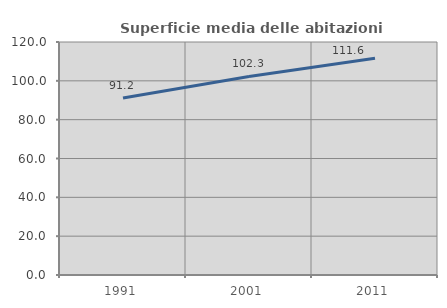
| Category | Superficie media delle abitazioni occupate |
|---|---|
| 1991.0 | 91.169 |
| 2001.0 | 102.262 |
| 2011.0 | 111.605 |